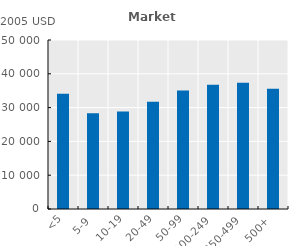
| Category | Series 0 |
|---|---|
| <5 | 34087.516 |
| 5-9 | 28350.981 |
| 10-19 | 28846.512 |
| 20-49 | 31707.474 |
| 50-99 | 35044.6 |
| 100-249 | 36755.475 |
| 250-499 | 37342.612 |
| 500+ | 35544.897 |